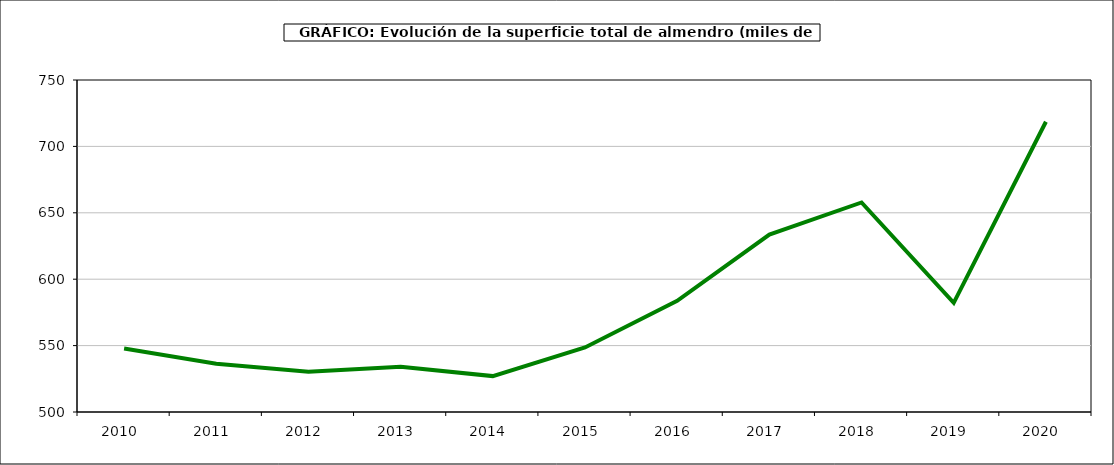
| Category | superficie almendro |
|---|---|
| 2010.0 | 547.822 |
| 2011.0 | 536.312 |
| 2012.0 | 530.223 |
| 2013.0 | 534.057 |
| 2014.0 | 527.029 |
| 2015.0 | 548.604 |
| 2016.0 | 583.673 |
| 2017.0 | 633.562 |
| 2018.0 | 657.768 |
| 2019.0 | 582.174 |
| 2020.0 | 718.54 |